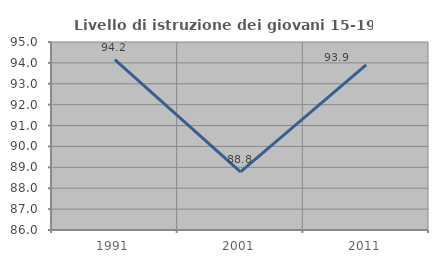
| Category | Livello di istruzione dei giovani 15-19 anni |
|---|---|
| 1991.0 | 94.156 |
| 2001.0 | 88.785 |
| 2011.0 | 93.902 |